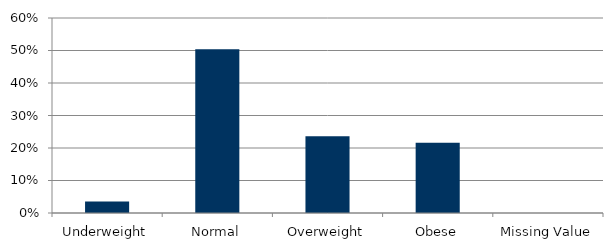
| Category | Total |
|---|---|
| Underweight | 0.035 |
| Normal | 0.504 |
| Overweight | 0.236 |
| Obese | 0.217 |
| Missing Value | 0 |